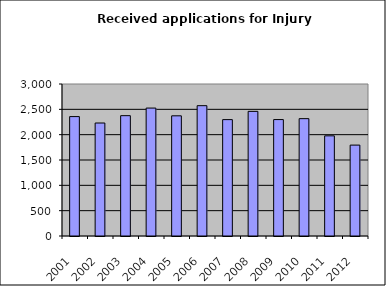
| Category | Series 1 |
|---|---|
| 2001.0 | 2357 |
| 2002.0 | 2230 |
| 2003.0 | 2375 |
| 2004.0 | 2525 |
| 2005.0 | 2372 |
| 2006.0 | 2572 |
| 2007.0 | 2297 |
| 2008.0 | 2460 |
| 2009.0 | 2298 |
| 2010.0 | 2316 |
| 2011.0 | 1977 |
| 2012.0 | 1794 |